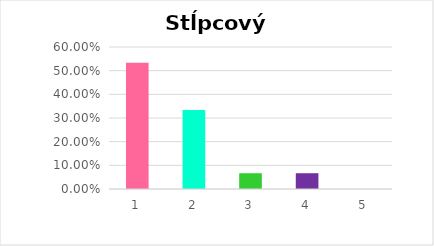
| Category | počet ž. v  |
|---|---|
| 0 | 0.533 |
| 1 | 0.333 |
| 2 | 0.067 |
| 3 | 0.067 |
| 4 | 0 |